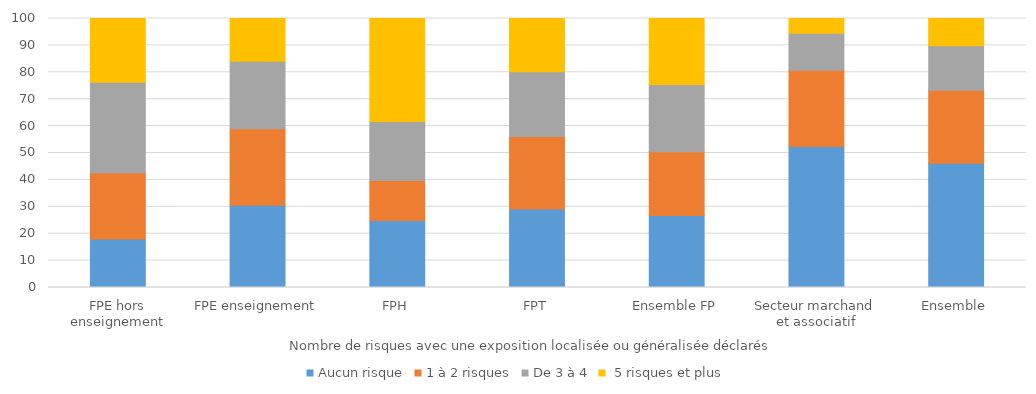
| Category | Aucun risque | 1 à 2 risques | De 3 à 4 |  5 risques et plus |
|---|---|---|---|---|
| FPE hors enseignement | 18 | 24.7 | 33.6 | 23.7 |
| FPE enseignement | 30.6 | 28.4 | 25.1 | 15.9 |
| FPH | 24.9 | 14.9 | 21.9 | 38.3 |
| FPT | 29.2 | 26.9 | 24.1 | 19.9 |
| Ensemble FP | 26.8 | 23.67 | 24.96 | 24.56 |
| Secteur marchand et associatif | 52.42 | 28.32 | 13.75 | 5.51 |
| Ensemble | 46.18 | 27.19 | 16.48 | 10.16 |